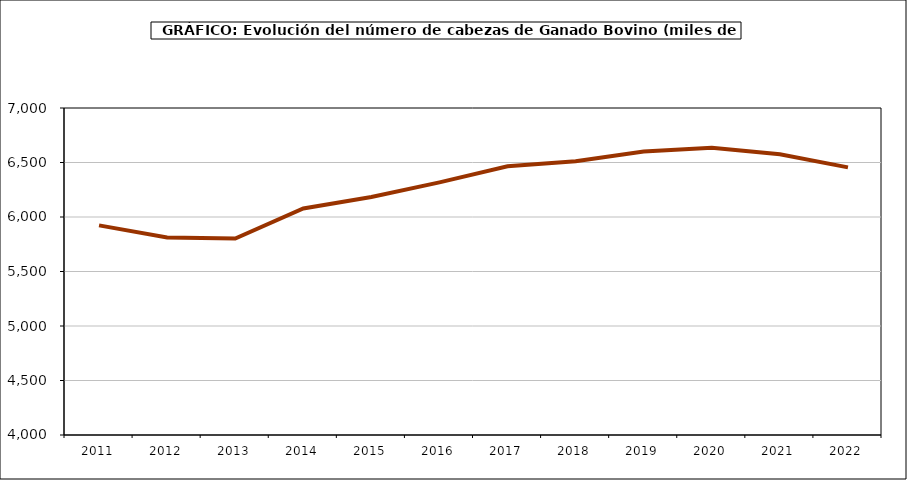
| Category | Series 0 |
|---|---|
| 2011.0 | 5923 |
| 2012.0 | 5812.605 |
| 2013.0 | 5802.22 |
| 2014.0 | 6078.733 |
| 2015.0 | 6182.908 |
| 2016.0 | 6317.641 |
| 2017.0 | 6465.747 |
| 2018.0 | 6510.592 |
| 2019.0 | 6600 |
| 2020.0 | 6636 |
| 2021.0 | 6576 |
| 2022.0 | 6455 |